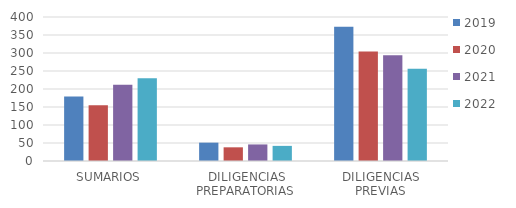
| Category | 2019 | 2020 | 2021 | 2022 |
|---|---|---|---|---|
| SUMARIOS | 179 | 155 | 212 | 230 |
| DILIGENCIAS PREPARATORIAS | 51 | 38 | 46 | 42 |
| DILIGENCIAS PREVIAS | 373 | 304 | 294 | 256 |